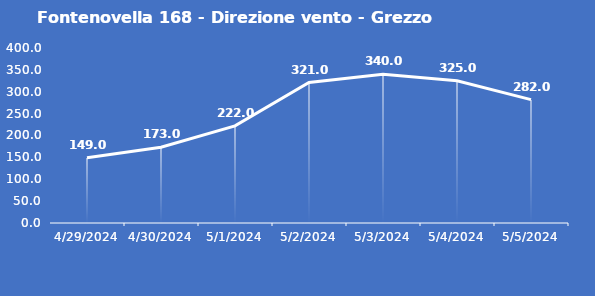
| Category | Fontenovella 168 - Direzione vento - Grezzo (°N) |
|---|---|
| 4/29/24 | 149 |
| 4/30/24 | 173 |
| 5/1/24 | 222 |
| 5/2/24 | 321 |
| 5/3/24 | 340 |
| 5/4/24 | 325 |
| 5/5/24 | 282 |